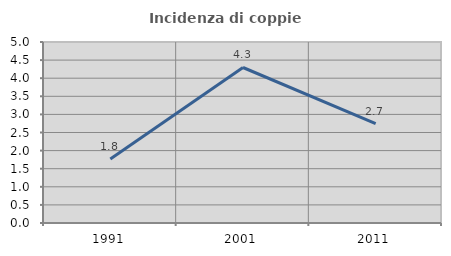
| Category | Incidenza di coppie miste |
|---|---|
| 1991.0 | 1.768 |
| 2001.0 | 4.296 |
| 2011.0 | 2.744 |